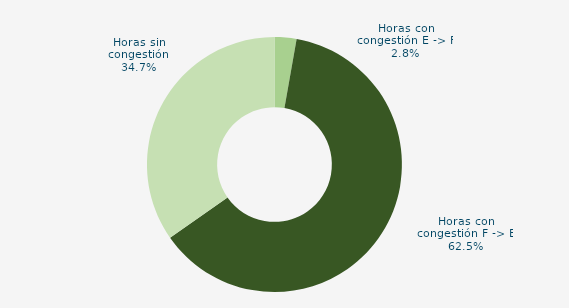
| Category | Horas con congestión E -> F |
|---|---|
| Horas con congestión E -> F | 2.778 |
| Horas con congestión F -> E | 62.5 |
| Horas sin congestión | 34.722 |